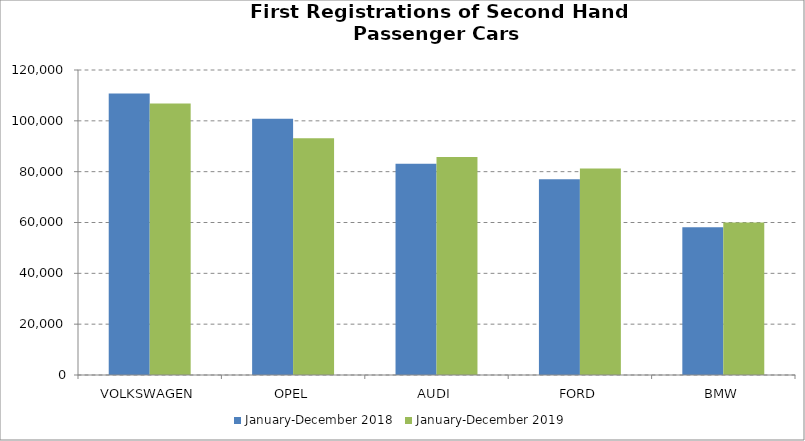
| Category | January-December 2018 | January-December 2019 |
|---|---|---|
| VOLKSWAGEN | 110777 | 106822 |
| OPEL | 100776 | 93158 |
| AUDI | 83122 | 85811 |
| FORD | 77029 | 81269 |
| BMW | 58171 | 60032 |